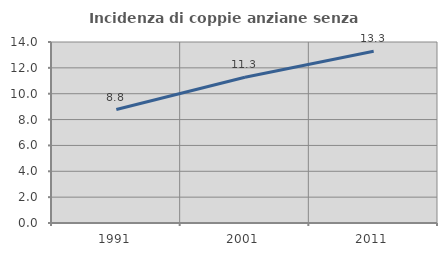
| Category | Incidenza di coppie anziane senza figli  |
|---|---|
| 1991.0 | 8.779 |
| 2001.0 | 11.273 |
| 2011.0 | 13.284 |